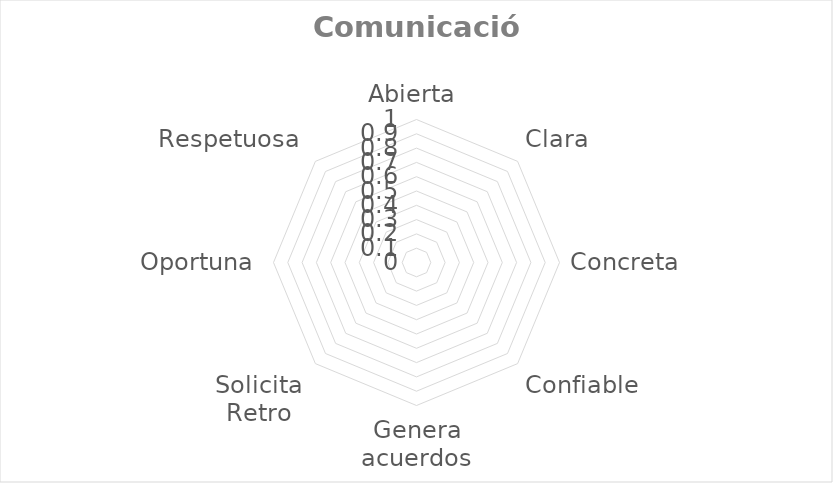
| Category | Series 0 |
|---|---|
| Abierta | 0 |
| Clara | 0 |
| Concreta | 0 |
| Confiable | 0 |
| Genera acuerdos | 0 |
| Solicita Retro | 0 |
| Oportuna | 0 |
| Respetuosa | 0 |